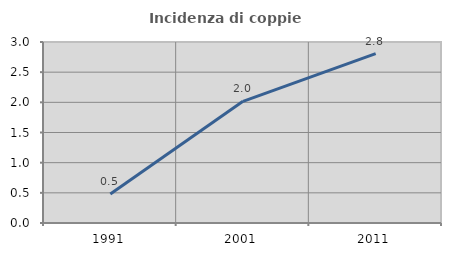
| Category | Incidenza di coppie miste |
|---|---|
| 1991.0 | 0.481 |
| 2001.0 | 2.016 |
| 2011.0 | 2.806 |